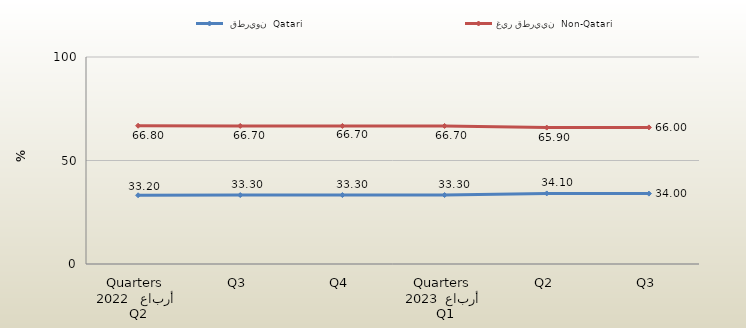
| Category |  قطريون  Qatari | غير قطريين  Non-Qatari |
|---|---|---|
| 0 | 33.2 | 66.8 |
| 1 | 33.3 | 66.7 |
| 2 | 33.3 | 66.7 |
| 3 | 33.3 | 66.7 |
| 4 | 34.1 | 65.9 |
| 5 | 34 | 66 |